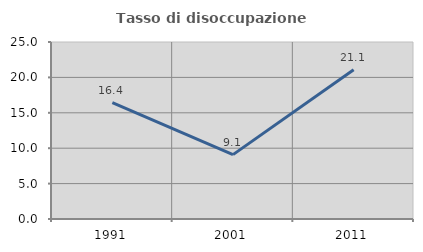
| Category | Tasso di disoccupazione giovanile  |
|---|---|
| 1991.0 | 16.429 |
| 2001.0 | 9.091 |
| 2011.0 | 21.084 |